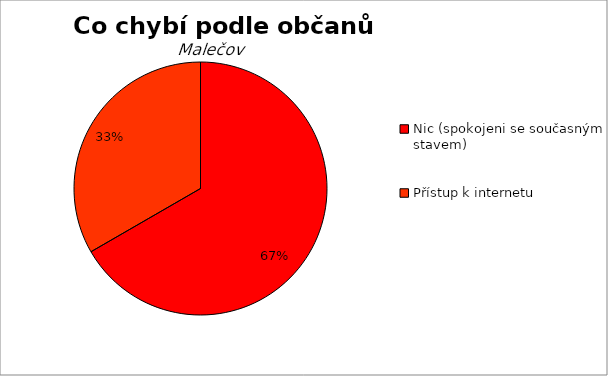
| Category | Series 0 |
|---|---|
| Nic (spokojeni se současným stavem) | 2 |
| Přístup k internetu | 1 |